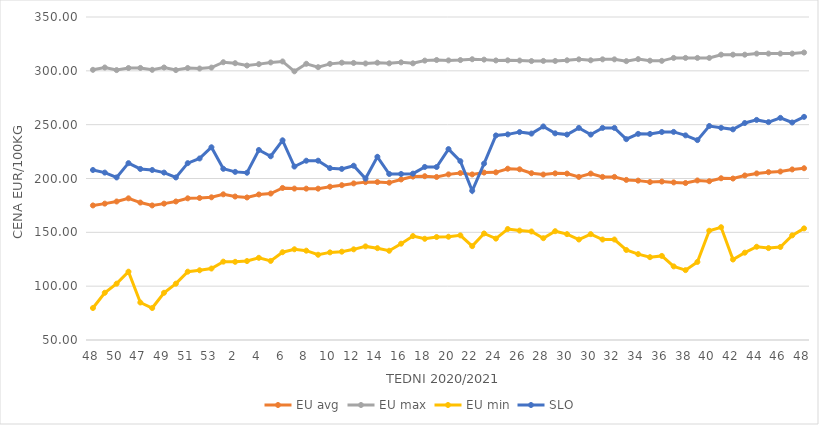
| Category | EU avg | EU max | EU min | SLO |
|---|---|---|---|---|
| 48.0 | 174.977 | 300.94 | 79.697 | 207.9 |
| 49.0 | 176.65 | 303.09 | 93.873 | 205.48 |
| 50.0 | 178.648 | 300.7 | 102.316 | 200.99 |
| 51.0 | 181.58 | 302.62 | 113.46 | 214.25 |
| 47.0 | 177.656 | 302.7 | 84.832 | 208.87 |
| 48.0 | 174.977 | 300.94 | 79.697 | 207.9 |
| 49.0 | 176.65 | 303.09 | 93.873 | 205.48 |
| 50.0 | 178.648 | 300.7 | 102.316 | 200.99 |
| 51.0 | 181.58 | 302.62 | 113.46 | 214.25 |
| 52.0 | 181.9 | 302.14 | 114.76 | 218.61 |
| 53.0 | 182.536 | 303 | 116.375 | 229 |
| 1.0 | 185.3 | 308 | 122.769 | 209 |
| 2.0 | 183.25 | 307.1 | 122.609 | 206.15 |
| 3.0 | 182.393 | 304.91 | 123.32 | 205.35 |
| 4.0 | 185.158 | 306.22 | 126.329 | 226.48 |
| 5.0 | 186.04 | 307.79 | 123.461 | 220.65 |
| 6.0 | 191.206 | 308.7 | 131.528 | 235.46 |
| 7.0 | 190.629 | 299.55 | 134.262 | 211.1 |
| 8.0 | 190.57 | 306.55 | 132.97 | 216.51 |
| 9.0 | 190.562 | 303.4 | 129.173 | 216.54 |
| 10.0 | 192.373 | 306.48 | 131.374 | 209.61 |
| 11.0 | 193.79 | 307.58 | 132.024 | 208.91 |
| 12.0 | 195.449 | 307.33 | 134.212 | 211.87 |
| 13.0 | 196.631 | 306.85 | 136.936 | 199.93 |
| 14.0 | 196.702 | 307.56 | 135.297 | 220.15 |
| 15.0 | 196.13 | 306.96 | 132.893 | 204.2 |
| 16.0 | 199.1 | 307.87 | 139.462 | 204.2 |
| 17.0 | 201.754 | 306.98 | 146.538 | 204.51 |
| 18.0 | 202.13 | 309.49 | 144.017 | 210.72 |
| 19.0 | 201.439 | 310.06 | 145.644 | 210.68 |
| 20.0 | 203.834 | 309.69 | 145.911 | 227.32 |
| 21.0 | 205.04 | 309.99 | 147.188 | 216.08 |
| 22.0 | 203.79 | 310.76 | 137.177 | 188.6 |
| 23.0 | 205.51 | 310.41 | 148.928 | 213.84 |
| 24.0 | 205.73 | 309.64 | 144.161 | 239.99 |
| 25.0 | 209.095 | 309.74 | 153.081 | 240.99 |
| 26.0 | 208.551 | 309.55 | 151.599 | 243.11 |
| 27.0 | 204.914 | 309.08 | 150.789 | 241.72 |
| 28.0 | 203.681 | 309.21 | 144.56 | 248.33 |
| 29.0 | 204.773 | 309.15 | 151.052 | 241.96 |
| 30.0 | 204.558 | 309.78 | 148.33 | 240.79 |
| 31.0 | 201.483 | 310.67 | 143.33 | 247 |
| 30.0 | 204.558 | 309.78 | 148.33 | 240.79 |
| 31.0 | 201.483 | 310.67 | 143.33 | 247 |
| 32.0 | 201.483 | 310.67 | 143.33 | 247 |
| 33.0 | 198.691 | 309 | 133.607 | 236.54 |
| 34.0 | 198.027 | 310.9 | 129.797 | 241.45 |
| 35.0 | 196.72 | 309.41 | 126.926 | 241.39 |
| 36.0 | 197.157 | 309.28 | 128.099 | 243.19 |
| 37.0 | 196.375 | 312 | 118.364 | 243.28 |
| 38.0 | 195.821 | 312 | 114.892 | 240.06 |
| 39.0 | 198.179 | 312 | 122.517 | 235.66 |
| 40.0 | 197.482 | 312 | 151.488 | 248.77 |
| 41.0 | 200.22 | 315 | 154.74 | 247.07 |
| 42.0 | 199.965 | 315 | 124.748 | 245.64 |
| 43.0 | 202.804 | 315 | 131.104 | 251.53 |
| 44.0 | 204.713 | 316 | 136.6 | 254.42 |
| 45.0 | 205.906 | 316 | 135.362 | 252.35 |
| 46.0 | 206.476 | 316 | 136.39 | 256.33 |
| 47.0 | 208.415 | 316 | 147.192 | 252.01 |
| 48.0 | 209.53 | 317 | 153.66 | 257.25 |